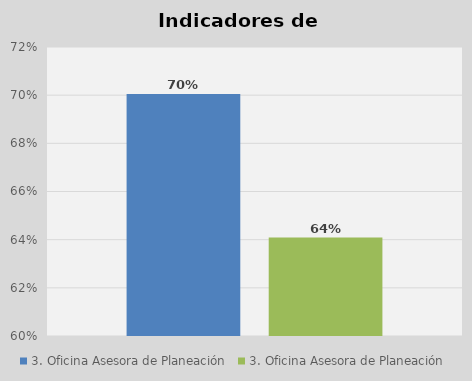
| Category | 3. Oficina Asesora de Planeación |
|---|---|
| 0 | 0.641 |